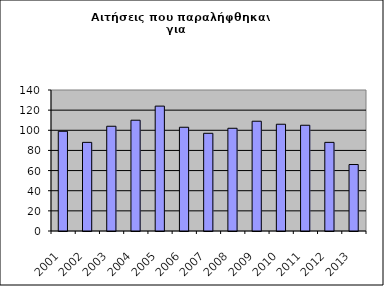
| Category | Series 1 |
|---|---|
| 2001.0 | 99 |
| 2002.0 | 88 |
| 2003.0 | 104 |
| 2004.0 | 110 |
| 2005.0 | 124 |
| 2006.0 | 103 |
| 2007.0 | 97 |
| 2008.0 | 102 |
| 2009.0 | 109 |
| 2010.0 | 106 |
| 2011.0 | 105 |
| 2012.0 | 88 |
| 2013.0 | 66 |